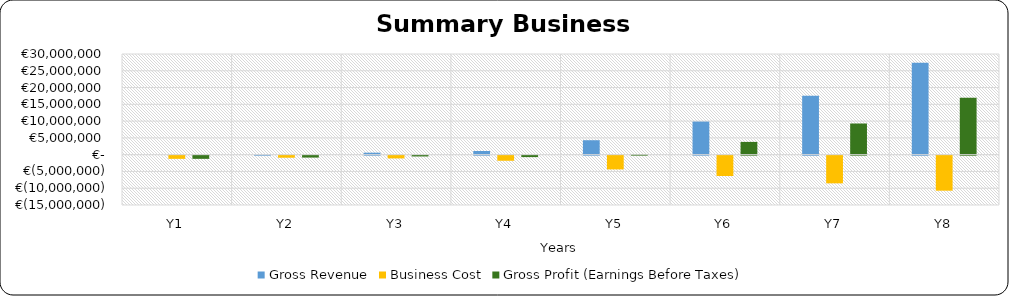
| Category | Gross Revenue | Business Cost | Gross Profit (Earnings Before Taxes) |
|---|---|---|---|
| 0 | 0 | -947267.41 | -947267.41 |
| 1 | 43596 | -611009.5 | -567413.5 |
| 2 | 590164 | -821714.944 | -231550.944 |
| 3 | 1085682.4 | -1515085.028 | -429402.628 |
| 4 | 4304360 | -4096880.913 | 207479.087 |
| 5 | 9861568 | -6058928.346 | 3802639.654 |
| 6 | 17538552 | -8247608.819 | 9290943.181 |
| 7 | 27385312 | -10435262.332 | 16950049.668 |